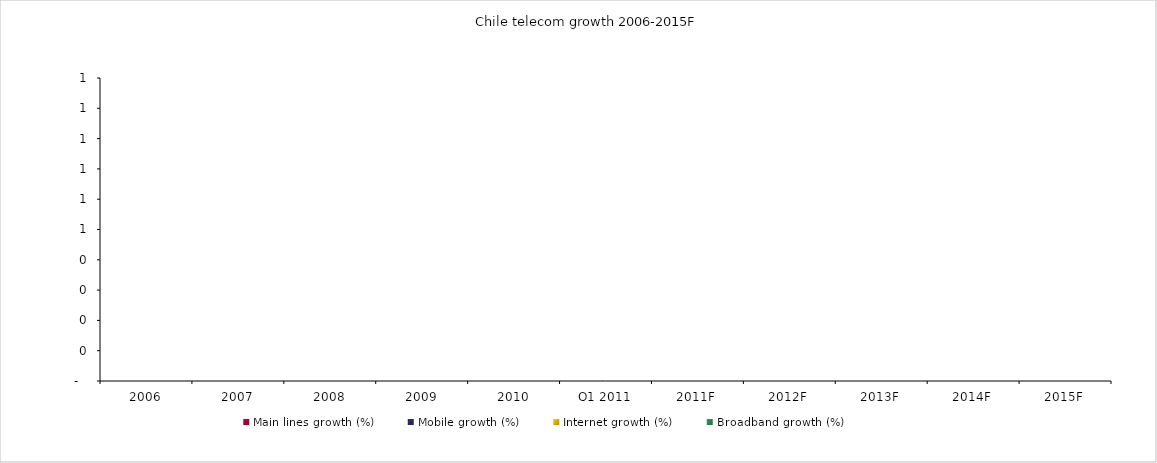
| Category | Main lines growth (%) | Mobile growth (%) | Internet growth (%) | Broadband growth (%) |
|---|---|---|---|---|
| 2006 | 0 | 0 | 0 | 0 |
| 2007 | 0 | 0 | 0 | 0 |
| 2008 | 0 | 0 | 0 | 0 |
| 2009 | 0 | 0 | 0 | 0 |
| 2010 | 0 | 0 | 0 | 0 |
| Q1 2011 | 0 | 0 | 0 | 0 |
| 2011F | 0 | 0 | 0 | 0 |
| 2012F | 0 | 0 | 0 | 0 |
| 2013F | 0 | 0 | 0 | 0 |
| 2014F | 0 | 0 | 0 | 0 |
| 2015F | 0 | 0 | 0 | 0 |